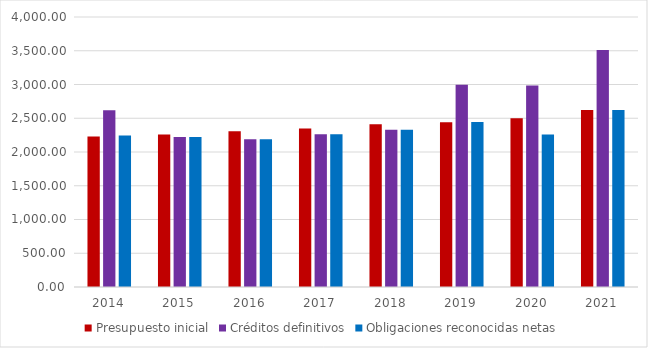
| Category | Presupuesto inicial | Créditos definitivos | Obligaciones reconocidas netas |
|---|---|---|---|
| 2014.0 | 2230.001 | 2617 | 2243.847 |
| 2015.0 | 2260.019 | 2220.814 | 2220.814 |
| 2016.0 | 2307.728 | 2190.718 | 2190.718 |
| 2017.0 | 2348.462 | 2263.368 | 2263.368 |
| 2018.0 | 2410.116 | 2330.279 | 2330.279 |
| 2019.0 | 2439.352 | 2996.974 | 2445.478 |
| 2020.0 | 2500.975 | 2986.225 | 2258.986 |
| 2021.0 | 2622.962 | 3510.739 | 2623.892 |